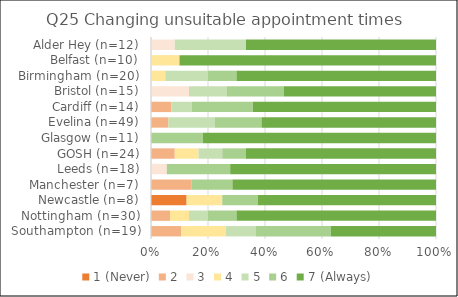
| Category | 1 (Never) | 2 | 3 | 4 | 5 | 6 | 7 (Always) |
|---|---|---|---|---|---|---|---|
| Southampton (n=19) | 0 | 2 | 0 | 3 | 2 | 5 | 7 |
| Nottingham (n=30) | 0 | 2 | 0 | 2 | 2 | 3 | 21 |
| Newcastle (n=8) | 1 | 0 | 0 | 1 | 0 | 1 | 5 |
| Manchester (n=7) | 0 | 1 | 0 | 0 | 0 | 1 | 5 |
| Leeds (n=18) | 0 | 0 | 1 | 0 | 0 | 4 | 13 |
| GOSH (n=24) | 0 | 2 | 0 | 2 | 2 | 2 | 16 |
| Glasgow (n=11) | 0 | 0 | 0 | 0 | 0 | 2 | 9 |
| Evelina (n=49) | 0 | 3 | 0 | 0 | 8 | 8 | 30 |
| Cardiff (n=14) | 0 | 1 | 0 | 0 | 1 | 3 | 9 |
| Bristol (n=15) | 0 | 0 | 2 | 0 | 2 | 3 | 8 |
| Birmingham (n=20) | 0 | 0 | 0 | 1 | 3 | 2 | 14 |
| Belfast (n=10) | 0 | 0 | 0 | 1 | 0 | 0 | 9 |
| Alder Hey (n=12) | 0 | 0 | 1 | 0 | 3 | 0 | 8 |